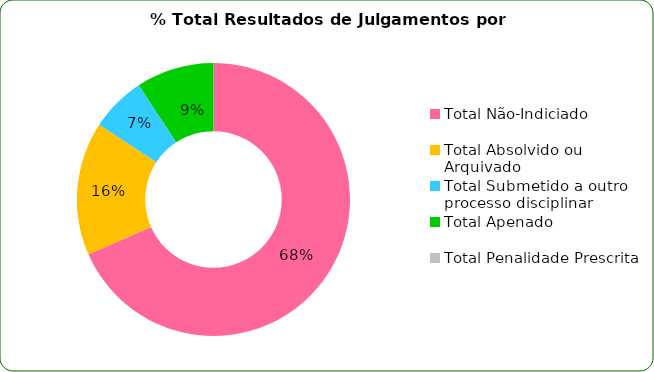
| Category | % Total |
|---|---|
| Total Não-Indiciado | 0.684 |
| Total Absolvido ou Arquivado | 0.158 |
| Total Submetido a outro processo disciplinar | 0.066 |
| Total Apenado | 0.092 |
| Total Penalidade Prescrita | 0 |